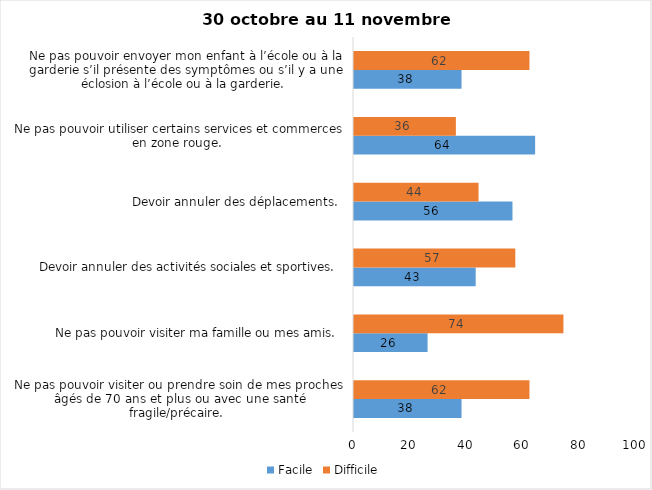
| Category | Facile | Difficile |
|---|---|---|
| Ne pas pouvoir visiter ou prendre soin de mes proches âgés de 70 ans et plus ou avec une santé fragile/précaire.  | 38 | 62 |
| Ne pas pouvoir visiter ma famille ou mes amis.  | 26 | 74 |
| Devoir annuler des activités sociales et sportives.  | 43 | 57 |
| Devoir annuler des déplacements.  | 56 | 44 |
| Ne pas pouvoir utiliser certains services et commerces en zone rouge.  | 64 | 36 |
| Ne pas pouvoir envoyer mon enfant à l’école ou à la garderie s’il présente des symptômes ou s’il y a une éclosion à l’école ou à la garderie.  | 38 | 62 |